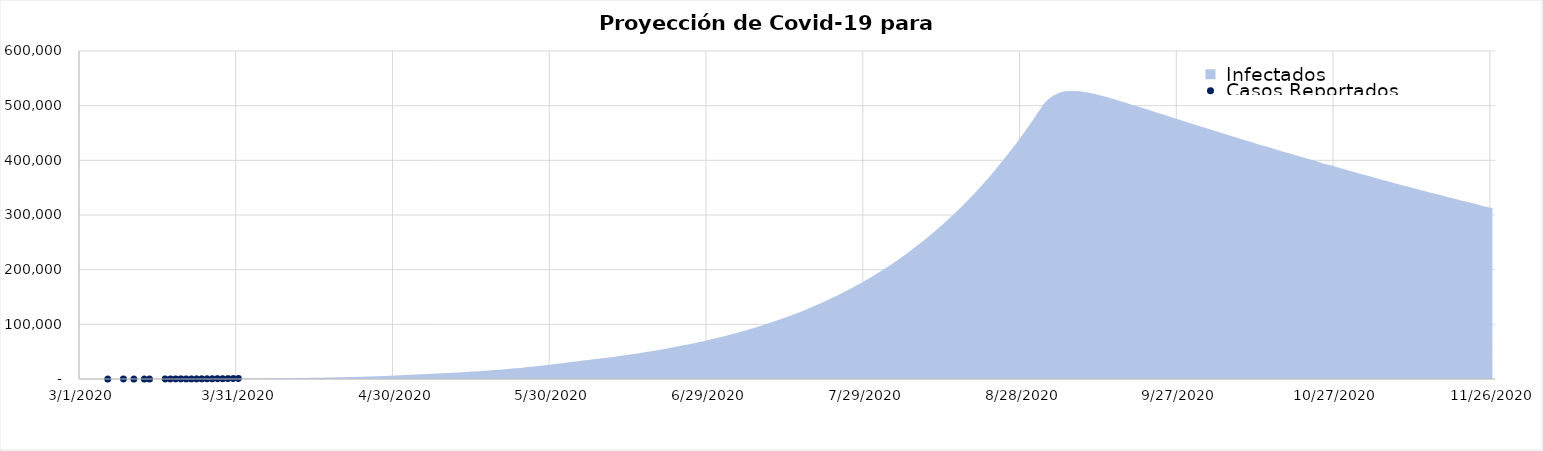
| Category | Series 0 |
|---|---|
| 3/1/20 | 5 |
| 3/2/20 | 23.939 |
| 3/3/20 | 38.301 |
| 3/4/20 | 49.869 |
| 3/5/20 | 59.825 |
| 3/6/20 | 68.964 |
| 3/7/20 | 77.823 |
| 3/8/20 | 86.782 |
| 3/9/20 | 96.112 |
| 3/10/20 | 106.021 |
| 3/11/20 | 116.679 |
| 3/12/20 | 128.23 |
| 3/13/20 | 140.81 |
| 3/14/20 | 154.548 |
| 3/15/20 | 169.578 |
| 3/16/20 | 186.038 |
| 3/17/20 | 204.074 |
| 3/18/20 | 223.845 |
| 3/19/20 | 245.523 |
| 3/20/20 | 269.295 |
| 3/21/20 | 295.364 |
| 3/22/20 | 323.954 |
| 3/23/20 | 355.31 |
| 3/24/20 | 389.7 |
| 3/25/20 | 427.418 |
| 3/26/20 | 468.786 |
| 3/27/20 | 514.157 |
| 3/28/20 | 563.919 |
| 3/29/20 | 618.497 |
| 3/30/20 | 678.357 |
| 3/31/20 | 744.011 |
| 4/1/20 | 816.018 |
| 4/2/20 | 887.491 |
| 4/3/20 | 960.257 |
| 4/4/20 | 1035.674 |
| 4/5/20 | 1114.79 |
| 4/6/20 | 1198.453 |
| 4/7/20 | 1287.385 |
| 4/8/20 | 1382.235 |
| 4/9/20 | 1483.612 |
| 4/10/20 | 1592.112 |
| 4/11/20 | 1708.336 |
| 4/12/20 | 1832.901 |
| 4/13/20 | 1966.451 |
| 4/14/20 | 2109.667 |
| 4/15/20 | 2263.267 |
| 4/16/20 | 2428.02 |
| 4/17/20 | 2604.744 |
| 4/18/20 | 2794.316 |
| 4/19/20 | 2997.674 |
| 4/20/20 | 3215.822 |
| 4/21/20 | 3449.839 |
| 4/22/20 | 3700.88 |
| 4/23/20 | 3970.183 |
| 4/24/20 | 4259.078 |
| 4/25/20 | 4568.989 |
| 4/26/20 | 4901.445 |
| 4/27/20 | 5258.085 |
| 4/28/20 | 5640.668 |
| 4/29/20 | 6051.08 |
| 4/30/20 | 6491.344 |
| 5/1/20 | 6963.63 |
| 5/2/20 | 7404.815 |
| 5/3/20 | 7829.037 |
| 5/4/20 | 8246.473 |
| 5/5/20 | 8664.52 |
| 5/6/20 | 9088.631 |
| 5/7/20 | 9522.901 |
| 5/8/20 | 9970.478 |
| 5/9/20 | 10433.857 |
| 5/10/20 | 10915.086 |
| 5/11/20 | 11415.913 |
| 5/12/20 | 11937.884 |
| 5/13/20 | 12482.422 |
| 5/14/20 | 13050.876 |
| 5/15/20 | 13644.558 |
| 5/16/20 | 14264.772 |
| 5/17/20 | 14912.834 |
| 5/18/20 | 15590.082 |
| 5/19/20 | 16297.893 |
| 5/20/20 | 17037.689 |
| 5/21/20 | 17810.945 |
| 5/22/20 | 18619.19 |
| 5/23/20 | 19464.022 |
| 5/24/20 | 20347.101 |
| 5/25/20 | 21270.162 |
| 5/26/20 | 22235.014 |
| 5/27/20 | 23243.548 |
| 5/28/20 | 24297.736 |
| 5/29/20 | 25399.64 |
| 5/30/20 | 26551.411 |
| 5/31/20 | 27755.299 |
| 6/1/20 | 29013.652 |
| 6/2/20 | 30204.689 |
| 6/3/20 | 31356.489 |
| 6/4/20 | 32489.488 |
| 6/5/20 | 33618.646 |
| 6/6/20 | 34755.002 |
| 6/7/20 | 35906.791 |
| 6/8/20 | 37080.242 |
| 6/9/20 | 38280.157 |
| 6/10/20 | 39510.323 |
| 6/11/20 | 40773.809 |
| 6/12/20 | 42073.178 |
| 6/13/20 | 43410.642 |
| 6/14/20 | 44788.174 |
| 6/15/20 | 46207.584 |
| 6/16/20 | 47670.578 |
| 6/17/20 | 49178.8 |
| 6/18/20 | 50733.864 |
| 6/19/20 | 52337.372 |
| 6/20/20 | 53990.933 |
| 6/21/20 | 55696.174 |
| 6/22/20 | 57454.75 |
| 6/23/20 | 59268.349 |
| 6/24/20 | 61138.701 |
| 6/25/20 | 63067.576 |
| 6/26/20 | 65056.794 |
| 6/27/20 | 67108.225 |
| 6/28/20 | 69223.79 |
| 6/29/20 | 71405.467 |
| 6/30/20 | 73655.288 |
| 7/1/20 | 75975.348 |
| 7/2/20 | 78367.801 |
| 7/3/20 | 80834.862 |
| 7/4/20 | 83378.813 |
| 7/5/20 | 86002.002 |
| 7/6/20 | 88706.845 |
| 7/7/20 | 91495.828 |
| 7/8/20 | 94371.51 |
| 7/9/20 | 97336.521 |
| 7/10/20 | 100393.571 |
| 7/11/20 | 103545.444 |
| 7/12/20 | 106795.005 |
| 7/13/20 | 110145.201 |
| 7/14/20 | 113599.063 |
| 7/15/20 | 117159.707 |
| 7/16/20 | 120830.337 |
| 7/17/20 | 124614.247 |
| 7/18/20 | 128514.821 |
| 7/19/20 | 132535.541 |
| 7/20/20 | 136679.983 |
| 7/21/20 | 140951.821 |
| 7/22/20 | 145354.83 |
| 7/23/20 | 149892.889 |
| 7/24/20 | 154569.982 |
| 7/25/20 | 159390.198 |
| 7/26/20 | 164357.737 |
| 7/27/20 | 169476.913 |
| 7/28/20 | 174752.15 |
| 7/29/20 | 180187.991 |
| 7/30/20 | 185789.095 |
| 7/31/20 | 191560.245 |
| 8/1/20 | 197506.344 |
| 8/2/20 | 203632.42 |
| 8/3/20 | 209943.63 |
| 8/4/20 | 216445.257 |
| 8/5/20 | 223142.718 |
| 8/6/20 | 230041.562 |
| 8/7/20 | 237147.471 |
| 8/8/20 | 244466.267 |
| 8/9/20 | 252003.907 |
| 8/10/20 | 259766.492 |
| 8/11/20 | 267760.26 |
| 8/12/20 | 275991.596 |
| 8/13/20 | 284467.026 |
| 8/14/20 | 293193.225 |
| 8/15/20 | 302177.011 |
| 8/16/20 | 311425.352 |
| 8/17/20 | 320945.361 |
| 8/18/20 | 330744.302 |
| 8/19/20 | 340829.587 |
| 8/20/20 | 351208.774 |
| 8/21/20 | 361889.574 |
| 8/22/20 | 372879.842 |
| 8/23/20 | 384187.581 |
| 8/24/20 | 395820.94 |
| 8/25/20 | 407788.212 |
| 8/26/20 | 420097.834 |
| 8/27/20 | 432758.381 |
| 8/28/20 | 445778.568 |
| 8/29/20 | 459167.242 |
| 8/30/20 | 472933.385 |
| 8/31/20 | 487086.101 |
| 9/1/20 | 501634.622 |
| 9/2/20 | 511833.59 |
| 9/3/20 | 518749.4 |
| 9/4/20 | 523187.336 |
| 9/5/20 | 525755.532 |
| 9/6/20 | 526913.254 |
| 9/7/20 | 527007.368 |
| 9/8/20 | 526299.863 |
| 9/9/20 | 524988.638 |
| 9/10/20 | 523223.195 |
| 9/11/20 | 521116.485 |
| 9/12/20 | 518753.86 |
| 9/13/20 | 516199.829 |
| 9/14/20 | 513503.153 |
| 9/15/20 | 510700.707 |
| 9/16/20 | 507820.383 |
| 9/17/20 | 504883.288 |
| 9/18/20 | 501905.404 |
| 9/19/20 | 498898.843 |
| 9/20/20 | 495872.791 |
| 9/21/20 | 492834.222 |
| 9/22/20 | 489788.44 |
| 9/23/20 | 486739.488 |
| 9/24/20 | 483690.453 |
| 9/25/20 | 480643.699 |
| 9/26/20 | 477601.046 |
| 9/27/20 | 474563.899 |
| 9/28/20 | 471533.351 |
| 9/29/20 | 468510.257 |
| 9/30/20 | 465495.293 |
| 10/1/20 | 462488.997 |
| 10/2/20 | 459491.804 |
| 10/3/20 | 456504.07 |
| 10/4/20 | 453526.09 |
| 10/5/20 | 450558.112 |
| 10/6/20 | 447600.349 |
| 10/7/20 | 444652.987 |
| 10/8/20 | 441716.188 |
| 10/9/20 | 438790.1 |
| 10/10/20 | 435874.855 |
| 10/11/20 | 432970.575 |
| 10/12/20 | 430077.375 |
| 10/13/20 | 427195.359 |
| 10/14/20 | 424324.629 |
| 10/15/20 | 421465.279 |
| 10/16/20 | 418617.399 |
| 10/17/20 | 415781.075 |
| 10/18/20 | 412956.39 |
| 10/19/20 | 410143.422 |
| 10/20/20 | 407342.248 |
| 10/21/20 | 404552.941 |
| 10/22/20 | 401775.571 |
| 10/23/20 | 399010.206 |
| 10/24/20 | 396256.91 |
| 10/25/20 | 393515.746 |
| 10/26/20 | 390786.773 |
| 10/27/20 | 388070.051 |
| 10/28/20 | 385365.634 |
| 10/29/20 | 382673.574 |
| 10/30/20 | 379993.924 |
| 10/31/20 | 377326.731 |
| 11/1/20 | 374672.041 |
| 11/2/20 | 372029.9 |
| 11/3/20 | 369400.349 |
| 11/4/20 | 366783.428 |
| 11/5/20 | 364179.176 |
| 11/6/20 | 361587.628 |
| 11/7/20 | 359008.818 |
| 11/8/20 | 356442.779 |
| 11/9/20 | 353889.541 |
| 11/10/20 | 351349.131 |
| 11/11/20 | 348821.576 |
| 11/12/20 | 346306.9 |
| 11/13/20 | 343805.127 |
| 11/14/20 | 341316.276 |
| 11/15/20 | 338840.367 |
| 11/16/20 | 336377.418 |
| 11/17/20 | 333927.443 |
| 11/18/20 | 331490.457 |
| 11/19/20 | 329066.471 |
| 11/20/20 | 326655.497 |
| 11/21/20 | 324257.544 |
| 11/22/20 | 321872.617 |
| 11/23/20 | 319500.725 |
| 11/24/20 | 317141.869 |
| 11/25/20 | 314796.054 |
| 11/26/20 | 312463.28 |